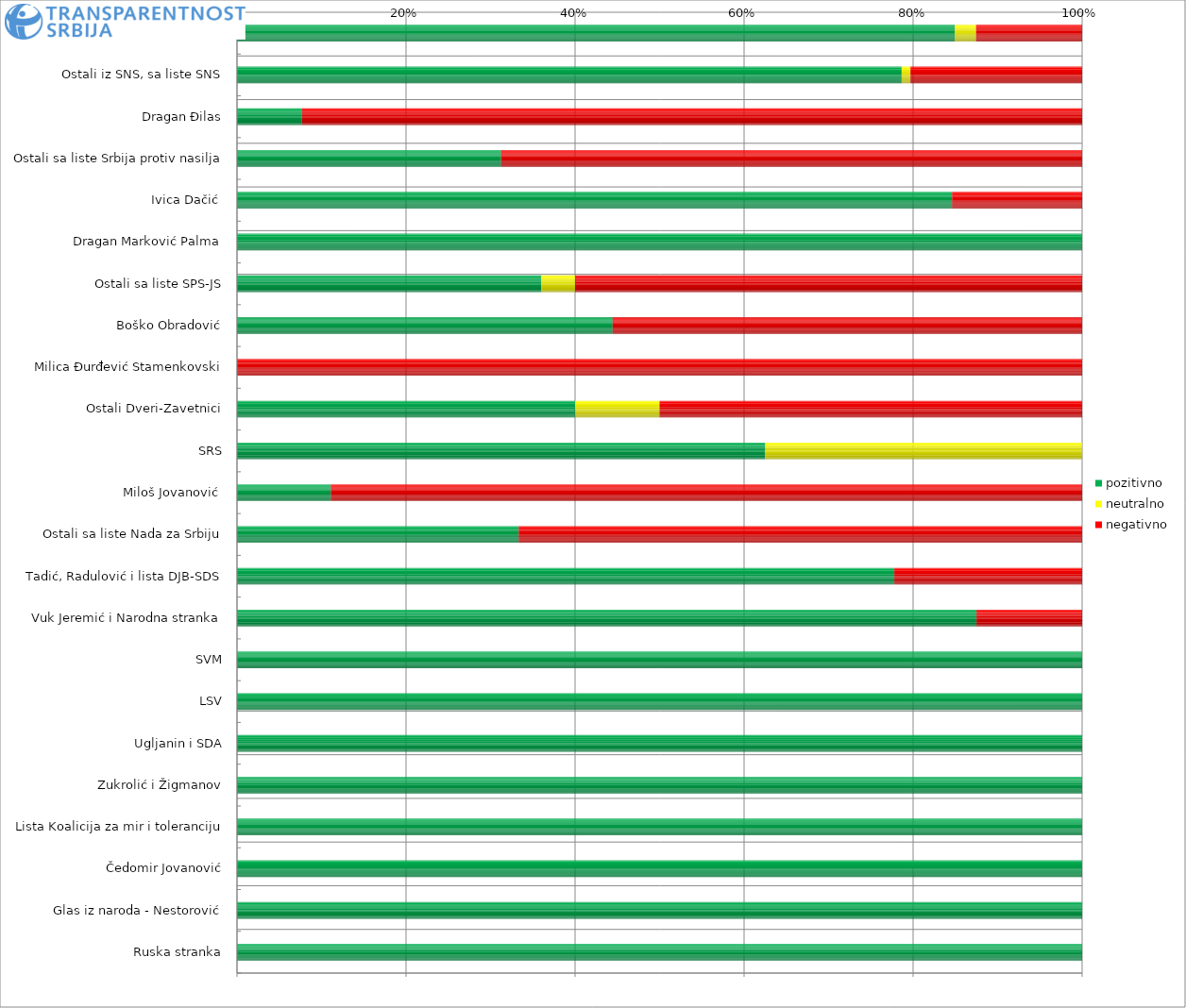
| Category | pozitivno | neutralno | negativno |
|---|---|---|---|
| Aleksandar Vučić | 237 | 7 | 35 |
| Ostali iz SNS, sa liste SNS | 151 | 2 | 39 |
| Dragan Đilas | 5 | 0 | 60 |
| Ostali sa liste Srbija protiv nasilja | 25 | 0 | 55 |
| Ivica Dačić  | 11 | 0 | 2 |
| Dragan Marković Palma | 1 | 0 | 0 |
| Ostali sa liste SPS-JS | 9 | 1 | 15 |
| Boško Obradović | 4 | 0 | 5 |
| Milica Đurđević Stamenkovski | 0 | 0 | 7 |
| Ostali Dveri-Zavetnici | 4 | 1 | 5 |
| SRS | 5 | 3 | 0 |
| Miloš Jovanović  | 1 | 0 | 8 |
| Ostali sa liste Nada za Srbiju | 1 | 0 | 2 |
| Tadić, Radulović i lista DJB-SDS | 7 | 0 | 2 |
| Vuk Jeremić i Narodna stranka | 7 | 0 | 1 |
| SVM | 2 | 0 | 0 |
| LSV | 2 | 0 | 0 |
| Ugljanin i SDA | 2 | 0 | 0 |
| Zukrolić i Žigmanov | 2 | 0 | 0 |
| Lista Koalicija za mir i toleranciju | 2 | 0 | 0 |
| Čedomir Jovanović | 2 | 0 | 0 |
| Glas iz naroda - Nestorović | 2 | 0 | 0 |
| Ruska stranka | 1 | 0 | 0 |